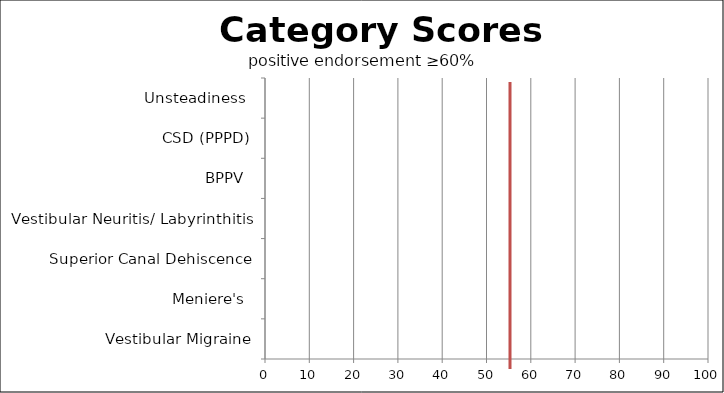
| Category | Category Scores |
|---|---|
| Vestibular Migraine | 0 |
| Meniere's  | 0 |
| Superior Canal Dehiscence | 0 |
| Vestibular Neuritis/ Labyrinthitis | 0 |
| BPPV  | 0 |
| CSD (PPPD) | 0 |
| Unsteadiness  | 0 |